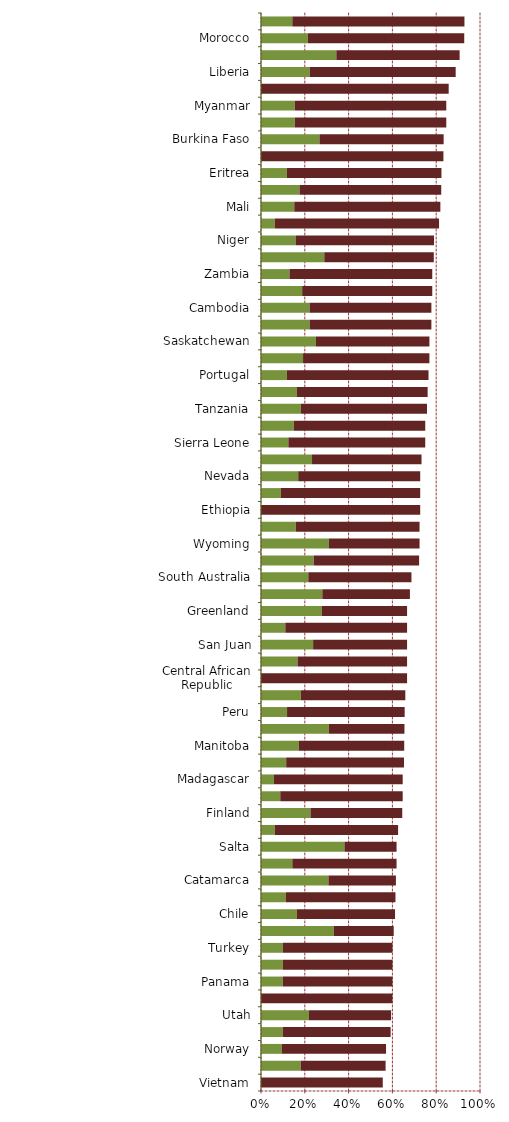
| Category | Series 0 | Series 1 |
|---|---|---|
| Vietnam | 0 | 0.556 |
| Quebec | 0.181 | 0.388 |
| Norway | 0.095 | 0.476 |
| Yukon | 0.099 | 0.493 |
| Utah | 0.219 | 0.375 |
| Nigeria | 0 | 0.6 |
| Panama | 0.1 | 0.5 |
| Thailand | 0.1 | 0.5 |
| Turkey | 0.1 | 0.5 |
| Alberta | 0.333 | 0.273 |
| Chile | 0.164 | 0.448 |
| South Africa | 0.114 | 0.5 |
| Catamarca | 0.308 | 0.308 |
| Guinea (Conakry) | 0.143 | 0.476 |
| Salta | 0.381 | 0.238 |
| Papua New Guinea | 0.063 | 0.563 |
| Finland | 0.226 | 0.419 |
| Democratic Republic of Congo(DRC) | 0.088 | 0.559 |
| Madagascar | 0.059 | 0.588 |
| Nova Scotia | 0.115 | 0.538 |
| Manitoba | 0.173 | 0.481 |
| Sweden | 0.31 | 0.345 |
| Peru | 0.119 | 0.537 |
| Northern Territory | 0.182 | 0.477 |
| Central African Republic | 0 | 0.667 |
| Egypt | 0.167 | 0.5 |
| San Juan | 0.238 | 0.429 |
| India | 0.111 | 0.556 |
| Greenland | 0.278 | 0.389 |
| Ireland | 0.28 | 0.4 |
| South Australia | 0.216 | 0.471 |
| Newfoundland & Labrador | 0.241 | 0.481 |
| Wyoming | 0.31 | 0.414 |
| Western Australia | 0.159 | 0.565 |
| Ethiopia | 0 | 0.727 |
| Laos | 0.091 | 0.636 |
| Nevada | 0.17 | 0.557 |
| Namibia | 0.233 | 0.5 |
| Sierra Leone | 0.125 | 0.625 |
| Uganda | 0.15 | 0.6 |
| Tanzania | 0.182 | 0.576 |
| Mexico | 0.164 | 0.597 |
| Portugal | 0.118 | 0.647 |
| Ivory Coast | 0.192 | 0.577 |
| Saskatchewan | 0.25 | 0.519 |
| Mauritania | 0.222 | 0.556 |
| Cambodia | 0.222 | 0.556 |
| Ghana | 0.188 | 0.594 |
| Zambia | 0.13 | 0.652 |
| New Brunswick | 0.289 | 0.5 |
| Niger | 0.158 | 0.632 |
| Russia | 0.063 | 0.75 |
| Mali | 0.152 | 0.667 |
| Guyana | 0.176 | 0.647 |
| Eritrea | 0.118 | 0.706 |
| Lesotho | 0 | 0.833 |
| Burkina Faso | 0.267 | 0.567 |
| Mozambique | 0.154 | 0.692 |
| Myanmar | 0.154 | 0.692 |
| Serbia | 0 | 0.857 |
| Liberia | 0.222 | 0.667 |
| Botswana | 0.344 | 0.563 |
| Morocco | 0.214 | 0.714 |
| Fiji | 0.143 | 0.786 |